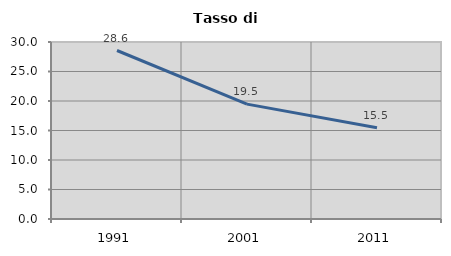
| Category | Tasso di disoccupazione   |
|---|---|
| 1991.0 | 28.558 |
| 2001.0 | 19.468 |
| 2011.0 | 15.474 |